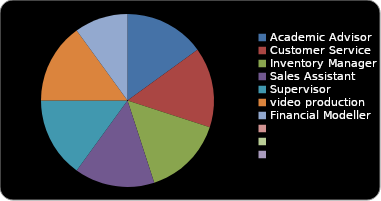
| Category | Series 1 |
|---|---|
| Academic Advisor | 30000 |
| Customer Service | 30000 |
| Inventory Manager | 30000 |
| Sales Assistant | 30000 |
| Supervisor | 30000 |
| video production | 30000 |
| Financial Modeller | 20000 |